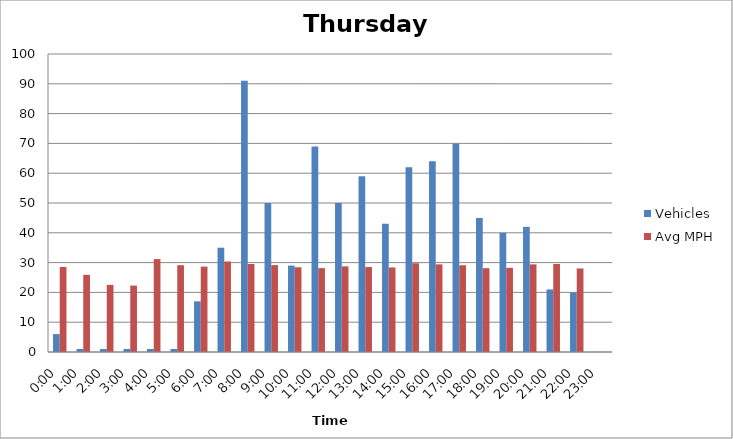
| Category | Vehicles | Avg MPH |
|---|---|---|
| 0:00 | 6 | 28.53 |
| 1:00 | 1 | 25.89 |
| 2:00 | 1 | 22.53 |
| 3:00 | 1 | 22.29 |
| 4:00 | 1 | 31.17 |
| 5:00 | 1 | 29.13 |
| 6:00 | 17 | 28.65 |
| 7:00 | 35 | 30.37 |
| 8:00 | 91 | 29.54 |
| 9:00 | 50 | 29.16 |
| 10:00 | 29 | 28.44 |
| 11:00 | 69 | 28.14 |
| 12:00 | 50 | 28.73 |
| 13:00 | 59 | 28.51 |
| 14:00 | 43 | 28.37 |
| 15:00 | 62 | 29.78 |
| 16:00 | 64 | 29.4 |
| 17:00 | 70 | 29.12 |
| 18:00 | 45 | 28.13 |
| 19:00 | 40 | 28.26 |
| 20:00 | 42 | 29.41 |
| 21:00 | 21 | 29.56 |
| 22:00 | 20 | 28.04 |
| 23:00 | 0 | 0 |